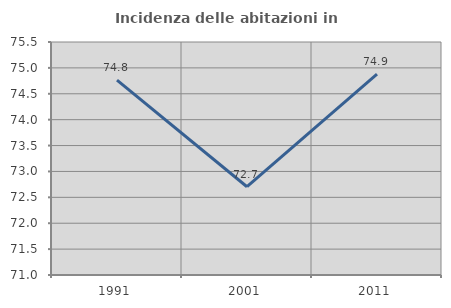
| Category | Incidenza delle abitazioni in proprietà  |
|---|---|
| 1991.0 | 74.763 |
| 2001.0 | 72.705 |
| 2011.0 | 74.878 |